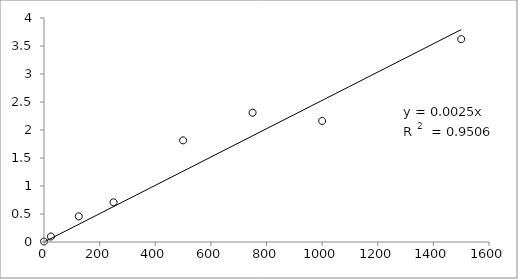
| Category | Standard curve |
|---|---|
| 1500.0 | 3.622 |
| 1000.0 | 2.162 |
| 750.0 | 2.309 |
| 500.0 | 1.814 |
| 250.0 | 0.709 |
| 125.0 | 0.458 |
| 25.0 | 0.098 |
| 0.0 | 0.009 |